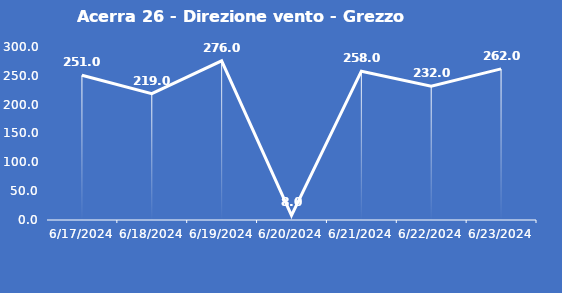
| Category | Acerra 26 - Direzione vento - Grezzo (°N) |
|---|---|
| 6/17/24 | 251 |
| 6/18/24 | 219 |
| 6/19/24 | 276 |
| 6/20/24 | 8 |
| 6/21/24 | 258 |
| 6/22/24 | 232 |
| 6/23/24 | 262 |